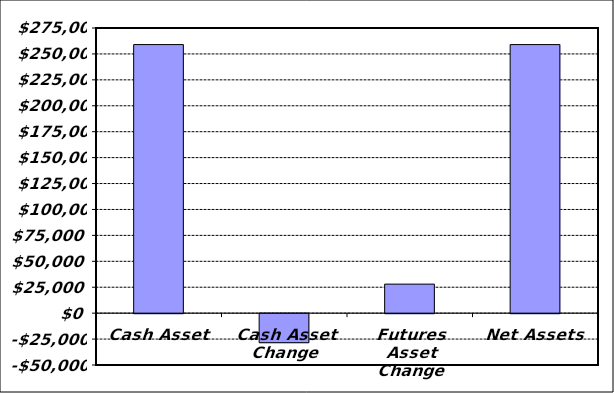
| Category | Series 0 |
|---|---|
| Cash Asset | 259000 |
| Cash Asset Change | -28000 |
| Futures Asset Change | 28000 |
| Net Assets | 259000 |